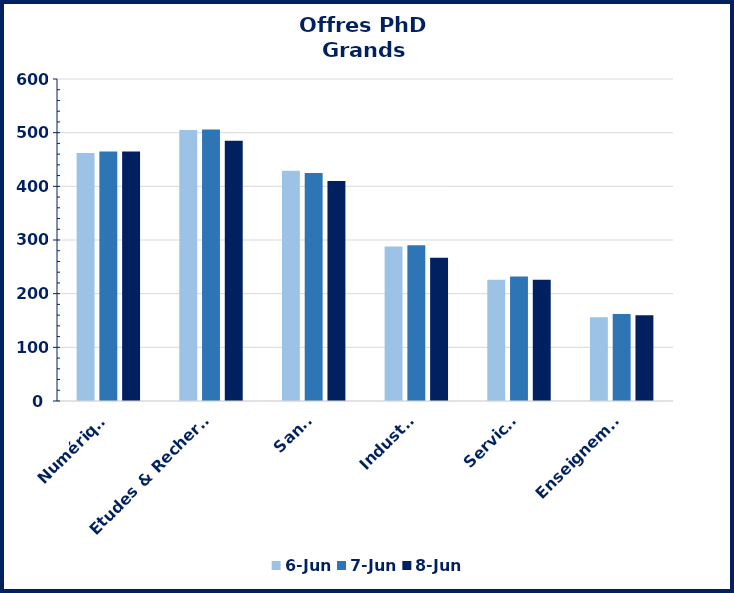
| Category | 06-juin | 07-juin | 08-juin |
|---|---|---|---|
| ​Numérique | 462 | 465 | 465 |
| Etudes & Recherche | 505 | 506 | 485 |
| Santé | 429 | 425 | 410 |
| Industrie | 288 | 290 | 267 |
| Services | 226 | 232 | 226 |
| Enseignement | 156 | 162 | 160 |